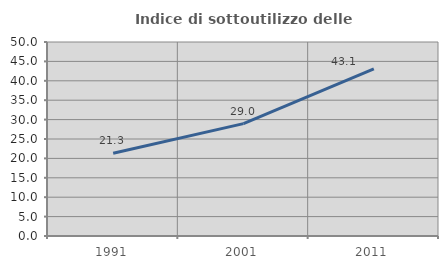
| Category | Indice di sottoutilizzo delle abitazioni  |
|---|---|
| 1991.0 | 21.335 |
| 2001.0 | 28.97 |
| 2011.0 | 43.095 |